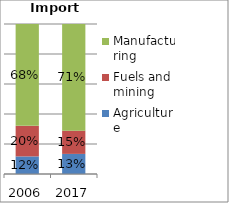
| Category | Agriculture | Fuels and mining | Manufacturing |
|---|---|---|---|
| 2006.0 | 0.117 | 0.204 | 0.679 |
| 2017.0 | 0.134 | 0.155 | 0.711 |